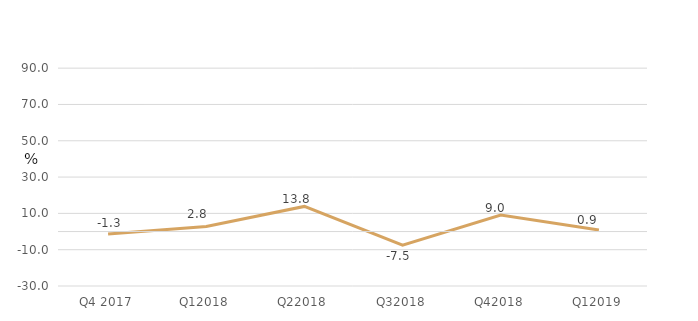
| Category | Series 0 |
|---|---|
| Q4 2017 | -1.298 |
| Q12018 | 2.787 |
| Q22018 | 13.833 |
| Q32018 | -7.471 |
| Q42018 | 9.033 |
| Q12019 | 0.89 |